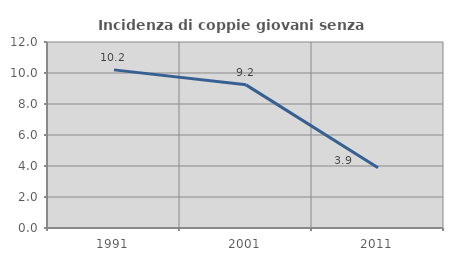
| Category | Incidenza di coppie giovani senza figli |
|---|---|
| 1991.0 | 10.202 |
| 2001.0 | 9.235 |
| 2011.0 | 3.886 |